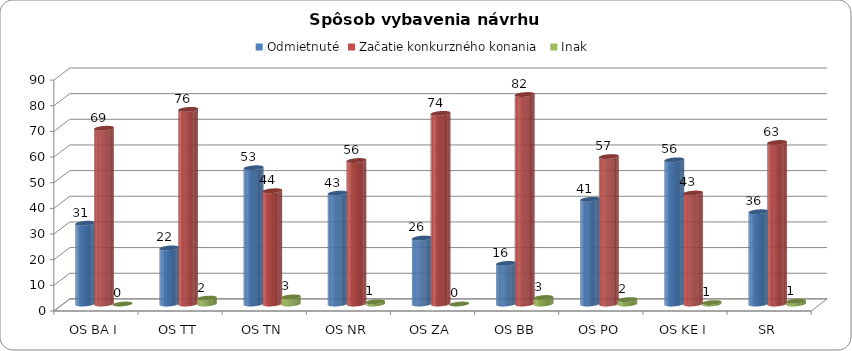
| Category | Odmietnuté | Začatie konkurzného konania  | Inak  |
|---|---|---|---|
| OS BA I | 31.487 | 68.513 | 0 |
| OS TT | 21.839 | 75.862 | 2.299 |
| OS TN | 53.103 | 44.138 | 2.759 |
| OS NR | 43.22 | 55.932 | 0.847 |
| OS ZA | 25.698 | 74.302 | 0 |
| OS BB | 15.823 | 81.646 | 2.532 |
| OS PO | 40.805 | 57.471 | 1.724 |
| OS KE I | 56.18 | 43.258 | 0.562 |
| SR | 35.962 | 62.952 | 1.085 |